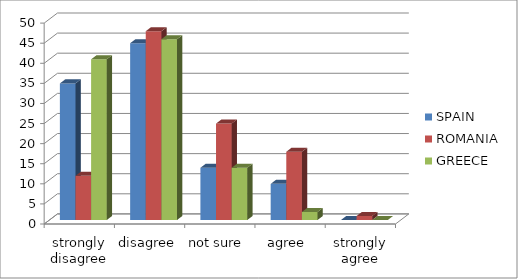
| Category | SPAIN | ROMANIA | GREECE |
|---|---|---|---|
| strongly disagree | 34 | 11 | 40 |
| disagree | 44 | 47 | 45 |
| not sure  | 13 | 24 | 13 |
| agree  | 9 | 17 | 2 |
| strongly agree | 0 | 1 | 0 |